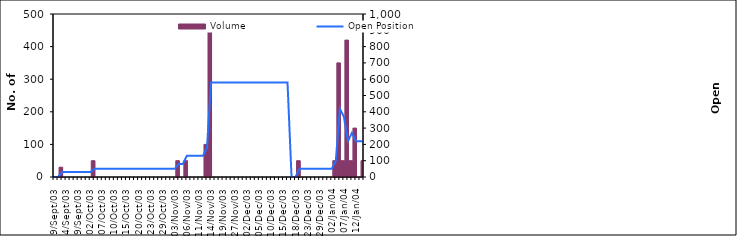
| Category | Volume  |
|---|---|
| 2003-09-19 | 1 |
| 2003-09-22 | 0 |
| 2003-09-23 | 30 |
| 2003-09-24 | 0 |
| 2003-09-25 | 0 |
| 2003-09-26 | 0 |
| 2003-09-29 | 0 |
| 2003-09-30 | 0 |
| 2003-10-01 | 0 |
| 2003-10-02 | 0 |
| 2003-10-03 | 50 |
| 2003-10-06 | 0 |
| 2003-10-07 | 0 |
| 2003-10-08 | 0 |
| 2003-10-09 | 0 |
| 2003-10-10 | 0 |
| 2003-10-13 | 0 |
| 2003-10-14 | 0 |
| 2003-10-15 | 0 |
| 2003-10-16 | 0 |
| 2003-10-17 | 0 |
| 2003-10-20 | 0 |
| 2003-10-21 | 0 |
| 2003-10-22 | 0 |
| 2003-10-23 | 0 |
| 2003-10-27 | 0 |
| 2003-10-28 | 0 |
| 2003-10-29 | 0 |
| 2003-10-30 | 0 |
| 2003-10-31 | 0 |
| 2003-11-03 | 0 |
| 2003-11-04 | 50 |
| 2003-11-05 | 0 |
| 2003-11-06 | 50 |
| 2003-11-07 | 0 |
| 2003-11-10 | 0 |
| 2003-11-11 | 0 |
| 2003-11-12 | 0 |
| 2003-11-13 | 100 |
| 2003-11-14 | 450 |
| 2003-11-17 | 0 |
| 2003-11-18 | 0 |
| 2003-11-19 | 0 |
| 2003-11-20 | 0 |
| 2003-11-21 | 0 |
| 2003-11-27 | 0 |
| 2003-11-28 | 0 |
| 2003-12-01 | 0 |
| 2003-12-02 | 0 |
| 2003-12-03 | 0 |
| 2003-12-04 | 0 |
| 2003-12-05 | 0 |
| 2003-12-08 | 0 |
| 2003-12-09 | 0 |
| 2003-12-10 | 0 |
| 2003-12-11 | 0 |
| 2003-12-12 | 0 |
| 2003-12-15 | 0 |
| 2003-12-16 | 0 |
| 2003-12-17 | 0 |
| 2003-12-18 | 0 |
| 2003-12-19 | 50 |
| 2003-12-22 | 0 |
| 2003-12-23 | 0 |
| 2003-12-24 | 0 |
| 2003-12-26 | 0 |
| 2003-12-29 | 0 |
| 2003-12-30 | 0 |
| 2003-12-31 | 0 |
| 2004-01-02 | 0 |
| 2004-01-05 | 50 |
| 2004-01-06 | 350 |
| 2004-01-07 | 50 |
| 2004-01-08 | 420 |
| 2004-01-09 | 50 |
| 2004-01-12 | 150 |
| 2004-01-13 | 0 |
| 2004-01-14 | 50 |